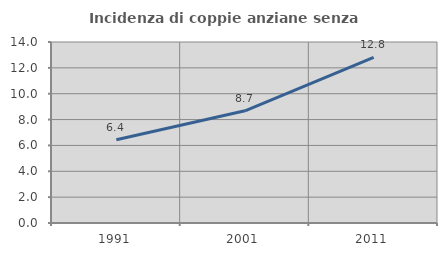
| Category | Incidenza di coppie anziane senza figli  |
|---|---|
| 1991.0 | 6.444 |
| 2001.0 | 8.678 |
| 2011.0 | 12.815 |